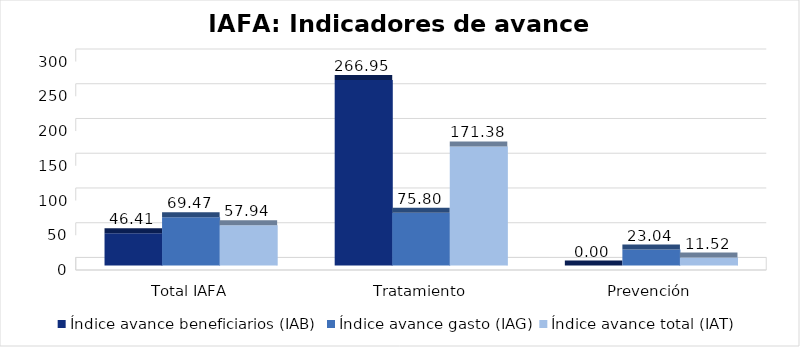
| Category | Índice avance beneficiarios (IAB)  | Índice avance gasto (IAG) | Índice avance total (IAT)  |
|---|---|---|---|
| Total IAFA | 46.415 | 69.474 | 57.944 |
| Tratamiento | 266.949 | 75.802 | 171.375 |
| Prevención | 0 | 23.035 | 11.518 |